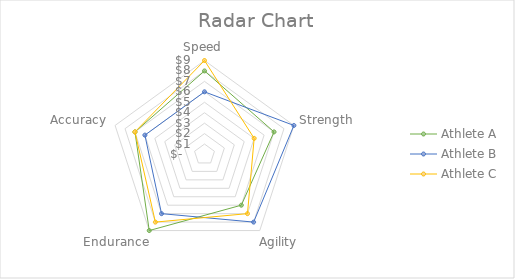
| Category | Athlete A | Athlete B | Athlete C |
|---|---|---|---|
| Speed | 8 | 6 | 9 |
| Strength | 7 | 9 | 5 |
| Agility | 6 | 8 | 7 |
| Endurance | 9 | 7 | 8 |
| Accuracy | 7 | 6 | 7 |